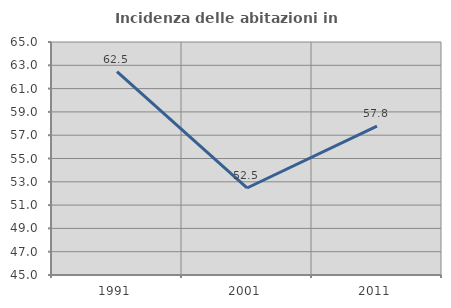
| Category | Incidenza delle abitazioni in proprietà  |
|---|---|
| 1991.0 | 62.456 |
| 2001.0 | 52.469 |
| 2011.0 | 57.781 |